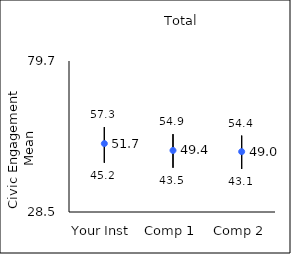
| Category | 25th percentile | 75th percentile | Mean |
|---|---|---|---|
| Your Inst | 45.2 | 57.3 | 51.7 |
| Comp 1 | 43.5 | 54.9 | 49.37 |
| Comp 2 | 43.1 | 54.4 | 48.96 |